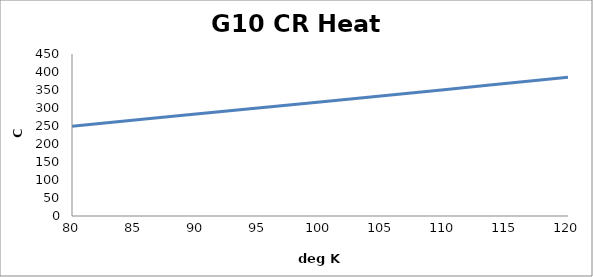
| Category | Series 0 |
|---|---|
| 80.0 | 249.407 |
| 90.0 | 283.031 |
| 100.0 | 316.86 |
| 110.0 | 350.919 |
| 120.0 | 385.211 |